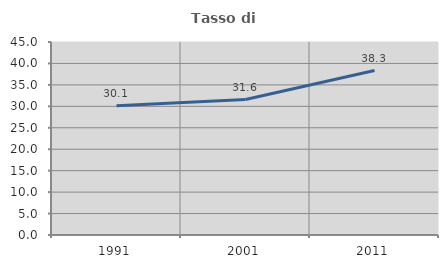
| Category | Tasso di occupazione   |
|---|---|
| 1991.0 | 30.118 |
| 2001.0 | 31.579 |
| 2011.0 | 38.34 |